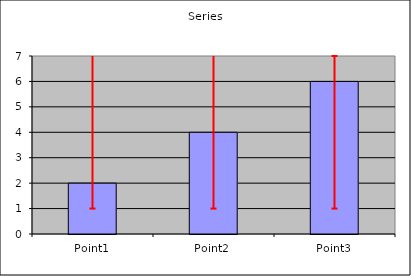
| Category | Series |
|---|---|
| Point1 | 2 |
| Point2 | 4 |
| Point3 | 6 |